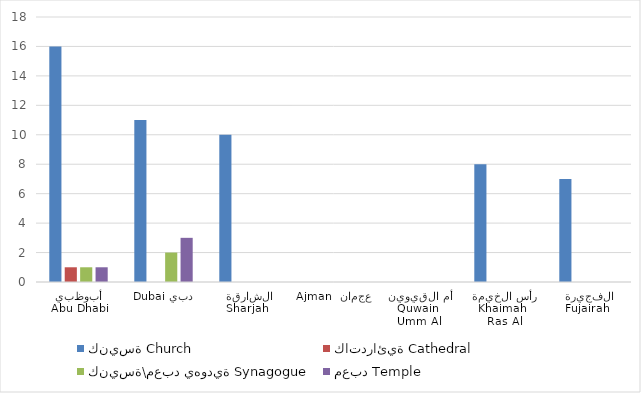
| Category | كنيسة | كاتدرائية | كنيسة\معبد يهودية | معبد |
|---|---|---|---|---|
| Abu Dhabi أبوظبي | 16 | 1 | 1 | 1 |
| Dubai دبي | 11 | 0 | 2 | 3 |
| Sharjah  الشارقة | 10 | 0 | 0 | 0 |
| Ajman  عجمان | 0 | 0 | 0 | 0 |
| Umm Al Quwain  أم القيوين | 0 | 0 | 0 | 0 |
| Ras Al Khaimah  رأس الخيمة | 8 | 0 | 0 | 0 |
| Fujairah  الفجيرة | 7 | 0 | 0 | 0 |